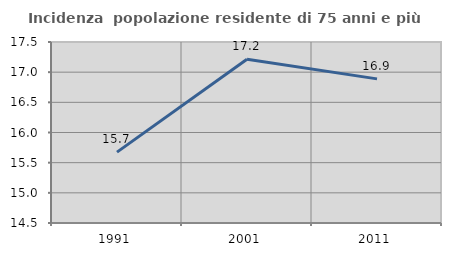
| Category | Incidenza  popolazione residente di 75 anni e più |
|---|---|
| 1991.0 | 15.675 |
| 2001.0 | 17.214 |
| 2011.0 | 16.889 |